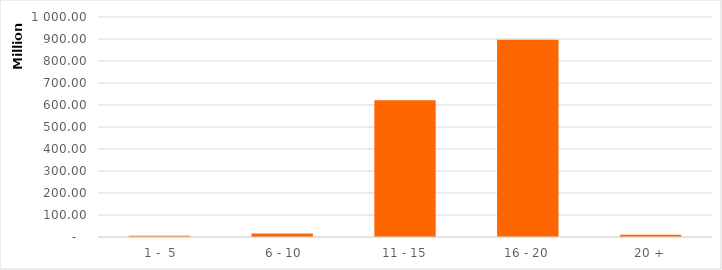
| Category | Series 0 |
|---|---|
|  1 -  5 | 5335499.18 |
|  6 - 10 | 16118068.94 |
| 11 - 15 | 621583495.89 |
| 16 - 20 | 896093929.42 |
| 20 + | 9665991.8 |